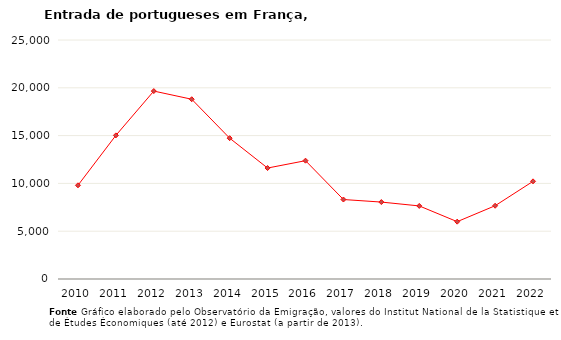
| Category | Entradas |
|---|---|
| 2010.0 | 9801 |
| 2011.0 | 15023 |
| 2012.0 | 19658 |
| 2013.0 | 18803 |
| 2014.0 | 14732 |
| 2015.0 | 11607 |
| 2016.0 | 12377 |
| 2017.0 | 8314 |
| 2018.0 | 8047 |
| 2019.0 | 7643 |
| 2020.0 | 5998 |
| 2021.0 | 7663 |
| 2022.0 | 10216 |